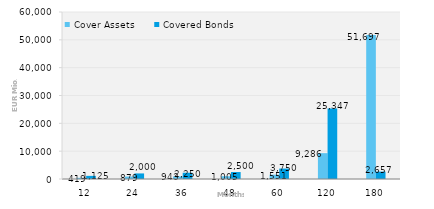
| Category | Cover Assets | Covered Bonds |
|---|---|---|
| 12.0 | 418.51 | 1125 |
| 24.0 | 879.17 | 2000 |
| 36.0 | 942.71 | 2250 |
| 48.0 | 1004.9 | 2500 |
| 60.0 | 1551.21 | 3750 |
| 120.0 | 9285.74 | 25347.2 |
| 180.0 | 51697.22 | 2657 |